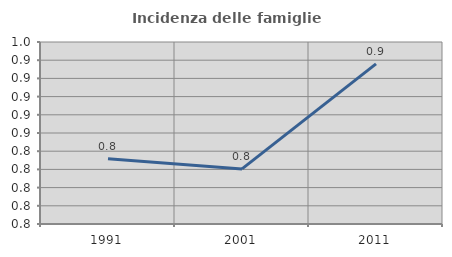
| Category | Incidenza delle famiglie numerose |
|---|---|
| 1991.0 | 0.822 |
| 2001.0 | 0.811 |
| 2011.0 | 0.926 |